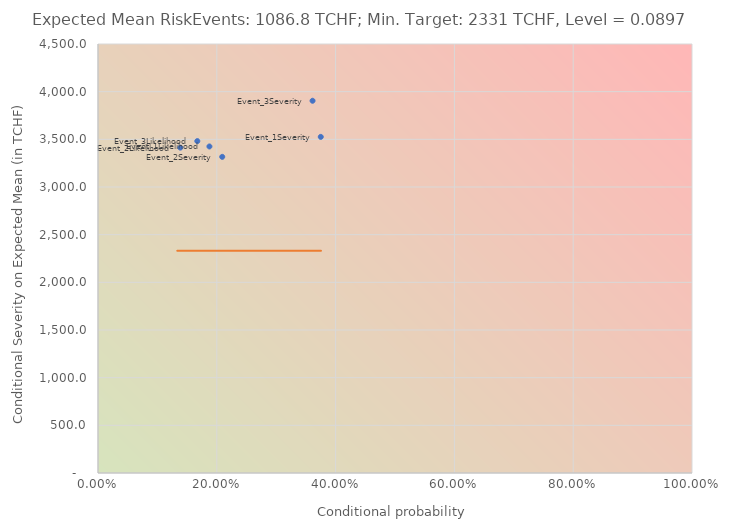
| Category | Series 0 |
|---|---|
| 0.18759124087591242 | 3425.143 |
| 0.3750278706800446 | 3525.685 |
| 0.138587611472644 | 3413.019 |
| 0.20914158305462655 | 3316.201 |
| 0.16719699161122362 | 3481.438 |
| 0.3612040133779264 | 3904.568 |